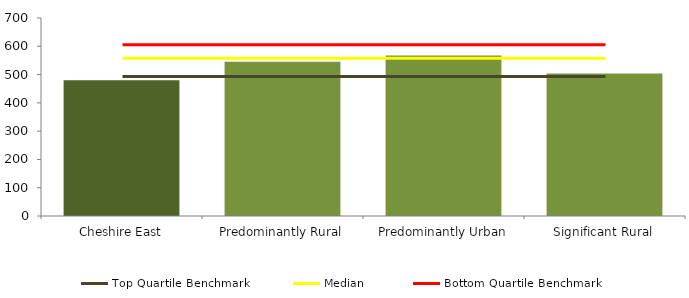
| Category | Series 0 |
|---|---|
| Cheshire East | 480 |
| Predominantly Rural | 545.236 |
| Predominantly Urban | 567.325 |
| Significant Rural | 504.2 |